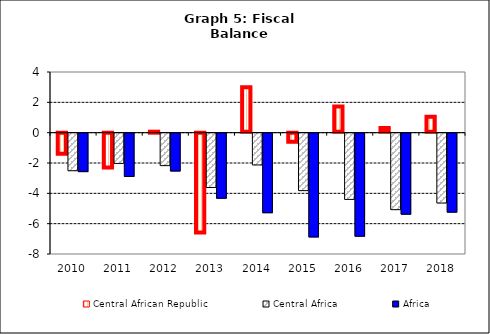
| Category | Central African Republic | Central Africa | Africa |
|---|---|---|---|
| 2010.0 | -1.452 | -2.477 | -2.535 |
| 2011.0 | -2.355 | -1.995 | -2.853 |
| 2012.0 | -0.002 | -2.14 | -2.495 |
| 2013.0 | -6.643 | -3.581 | -4.291 |
| 2014.0 | 2.989 | -2.096 | -5.245 |
| 2015.0 | -0.664 | -3.788 | -6.84 |
| 2016.0 | 1.724 | -4.368 | -6.79 |
| 2017.0 | 0.307 | -5.043 | -5.342 |
| 2018.0 | 1.046 | -4.606 | -5.208 |